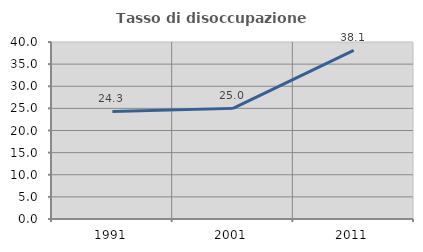
| Category | Tasso di disoccupazione giovanile  |
|---|---|
| 1991.0 | 24.299 |
| 2001.0 | 25 |
| 2011.0 | 38.095 |